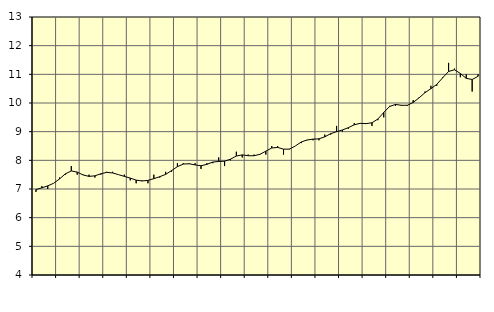
| Category | Piggar | Offentlig förvaltning m.m., SNI 84, 99 |
|---|---|---|
| nan | 6.9 | 6.98 |
| 1.0 | 7.1 | 7.04 |
| 1.0 | 7 | 7.11 |
| 1.0 | 7.2 | 7.2 |
| nan | 7.4 | 7.35 |
| 2.0 | 7.5 | 7.53 |
| 2.0 | 7.8 | 7.63 |
| 2.0 | 7.5 | 7.59 |
| nan | 7.5 | 7.49 |
| 3.0 | 7.5 | 7.44 |
| 3.0 | 7.4 | 7.46 |
| 3.0 | 7.5 | 7.53 |
| nan | 7.6 | 7.58 |
| 4.0 | 7.6 | 7.56 |
| 4.0 | 7.5 | 7.5 |
| 4.0 | 7.5 | 7.44 |
| nan | 7.3 | 7.38 |
| 5.0 | 7.2 | 7.31 |
| 5.0 | 7.3 | 7.28 |
| 5.0 | 7.2 | 7.3 |
| nan | 7.5 | 7.36 |
| 6.0 | 7.4 | 7.43 |
| 6.0 | 7.6 | 7.51 |
| 6.0 | 7.6 | 7.64 |
| nan | 7.9 | 7.78 |
| 7.0 | 7.9 | 7.87 |
| 7.0 | 7.9 | 7.88 |
| 7.0 | 7.9 | 7.84 |
| nan | 7.7 | 7.81 |
| 8.0 | 7.9 | 7.86 |
| 8.0 | 7.9 | 7.94 |
| 8.0 | 8.1 | 7.96 |
| nan | 7.8 | 7.97 |
| 9.0 | 8 | 8.04 |
| 9.0 | 8.3 | 8.15 |
| 9.0 | 8.1 | 8.19 |
| nan | 8.2 | 8.16 |
| 10.0 | 8.2 | 8.16 |
| 10.0 | 8.2 | 8.21 |
| 10.0 | 8.2 | 8.32 |
| nan | 8.5 | 8.43 |
| 11.0 | 8.5 | 8.45 |
| 11.0 | 8.2 | 8.39 |
| 11.0 | 8.4 | 8.39 |
| nan | 8.5 | 8.5 |
| 12.0 | 8.6 | 8.64 |
| 12.0 | 8.7 | 8.71 |
| 12.0 | 8.7 | 8.74 |
| nan | 8.7 | 8.75 |
| 13.0 | 8.9 | 8.82 |
| 13.0 | 8.9 | 8.93 |
| 13.0 | 9.2 | 9 |
| nan | 9 | 9.06 |
| 14.0 | 9.1 | 9.14 |
| 14.0 | 9.3 | 9.24 |
| 14.0 | 9.3 | 9.29 |
| nan | 9.3 | 9.28 |
| 15.0 | 9.2 | 9.31 |
| 15.0 | 9.4 | 9.44 |
| 15.0 | 9.5 | 9.67 |
| nan | 9.9 | 9.88 |
| 16.0 | 9.9 | 9.95 |
| 16.0 | 9.9 | 9.92 |
| 16.0 | 9.9 | 9.92 |
| nan | 10.1 | 10.02 |
| 17.0 | 10.2 | 10.18 |
| 17.0 | 10.4 | 10.36 |
| 17.0 | 10.6 | 10.5 |
| nan | 10.6 | 10.65 |
| 18.0 | 10.9 | 10.88 |
| 18.0 | 11.4 | 11.1 |
| 18.0 | 11.2 | 11.16 |
| nan | 10.9 | 11.03 |
| 19.0 | 11 | 10.86 |
| 19.0 | 10.4 | 10.82 |
| 19.0 | 11 | 10.93 |